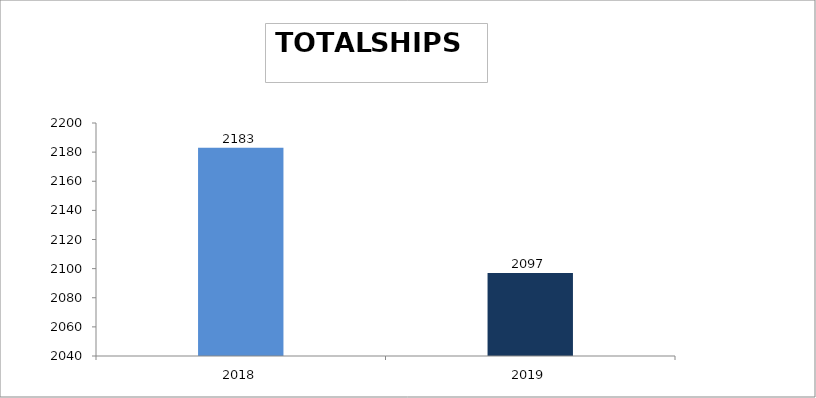
| Category | 2019 |
|---|---|
| 2018.0 | 2183 |
| 2019.0 | 2097 |